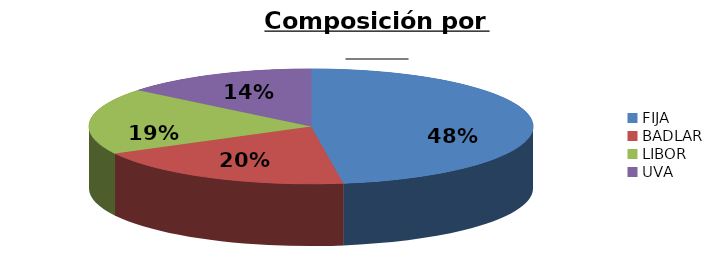
| Category | % |
|---|---|
| FIJA | 0.477 |
| BADLAR | 0.195 |
| LIBOR | 0.186 |
| UVA | 0.142 |